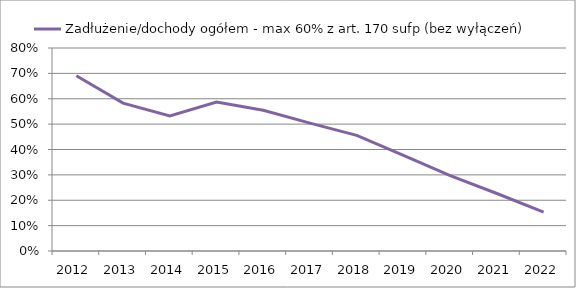
| Category | Zadłużenie/dochody ogółem - max 60% z art. 170 sufp (bez wyłączeń) |
|---|---|
| 2012.0 | 0.691 |
| 2013.0 | 0.583 |
| 2014.0 | 0.532 |
| 2015.0 | 0.587 |
| 2016.0 | 0.555 |
| 2017.0 | 0.504 |
| 2018.0 | 0.456 |
| 2019.0 | 0.377 |
| 2020.0 | 0.297 |
| 2021.0 | 0.227 |
| 2022.0 | 0.153 |